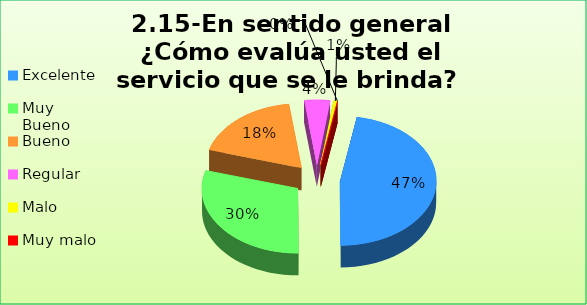
| Category | Series 0 |
|---|---|
| Excelente | 0.471 |
| Muy Bueno | 0.296 |
| Bueno  | 0.184 |
| Regular  | 0.043 |
| Malo  | 0.006 |
| Muy malo  | 0 |